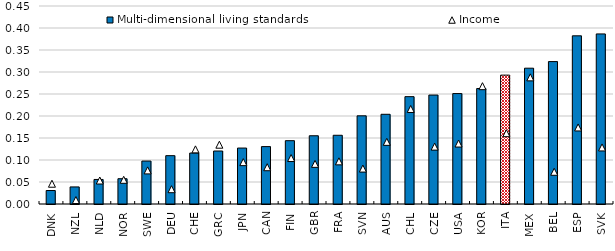
| Category | Multi-dimensional living standards |
|---|---|
| DNK | 0.031 |
| NZL | 0.039 |
| NLD | 0.056 |
| NOR | 0.057 |
| SWE | 0.098 |
| DEU | 0.11 |
| CHE | 0.116 |
| GRC | 0.12 |
| JPN | 0.127 |
| CAN | 0.13 |
| FIN | 0.144 |
| GBR | 0.155 |
| FRA | 0.156 |
| SVN | 0.2 |
| AUS | 0.204 |
| CHL | 0.244 |
| CZE | 0.248 |
| USA | 0.251 |
| KOR | 0.262 |
| ITA | 0.293 |
| MEX | 0.309 |
| BEL | 0.324 |
| ESP | 0.382 |
| SVK | 0.387 |